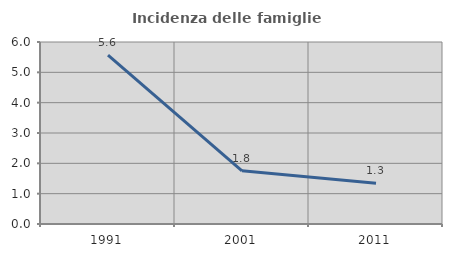
| Category | Incidenza delle famiglie numerose |
|---|---|
| 1991.0 | 5.566 |
| 2001.0 | 1.752 |
| 2011.0 | 1.34 |